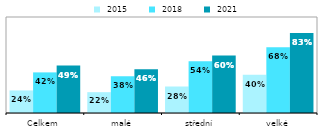
| Category |  2015 |  2018 |  2021 |
|---|---|---|---|
| Celkem | 0.235 | 0.423 | 0.494 |
| malé | 0.217 | 0.384 | 0.455 |
| střední | 0.276 | 0.54 | 0.598 |
| velké | 0.399 | 0.684 | 0.834 |